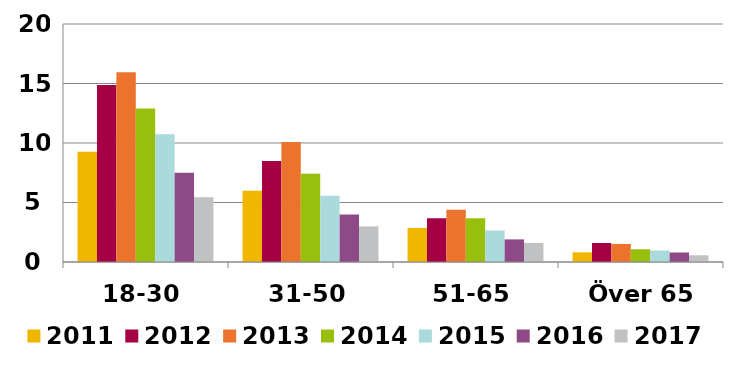
| Category | 2011 | 2012 | 2013 | 2014 | 2015 | 2016 | 2017 |
|---|---|---|---|---|---|---|---|
| 18-30 | 9.257 | 14.874 | 15.95 | 12.908 | 10.734 | 7.5 | 5.45 |
| 31-50 | 5.985 | 8.494 | 10.077 | 7.413 | 5.571 | 4 | 2.993 |
| 51-65 | 2.86 | 3.674 | 4.388 | 3.679 | 2.65 | 1.9 | 1.605 |
| Över 65 | 0.81 | 1.595 | 1.517 | 1.072 | 0.966 | 0.8 | 0.564 |